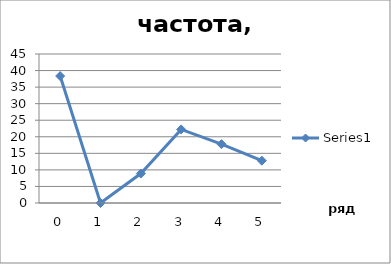
| Category | Series 0 |
|---|---|
| 0.0 | 38.333 |
| 1.0 | 0 |
| 2.0 | 8.889 |
| 3.0 | 22.222 |
| 4.0 | 17.778 |
| 5.0 | 12.778 |